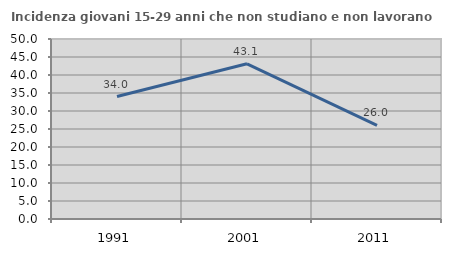
| Category | Incidenza giovani 15-29 anni che non studiano e non lavorano  |
|---|---|
| 1991.0 | 34.021 |
| 2001.0 | 43.116 |
| 2011.0 | 26.033 |